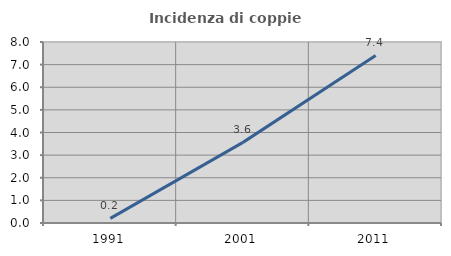
| Category | Incidenza di coppie miste |
|---|---|
| 1991.0 | 0.204 |
| 2001.0 | 3.563 |
| 2011.0 | 7.407 |